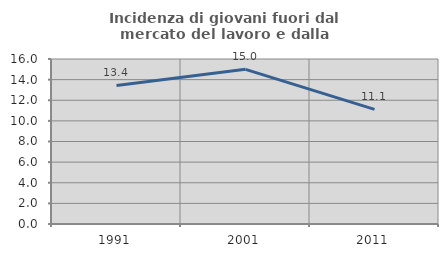
| Category | Incidenza di giovani fuori dal mercato del lavoro e dalla formazione  |
|---|---|
| 1991.0 | 13.433 |
| 2001.0 | 15 |
| 2011.0 | 11.111 |